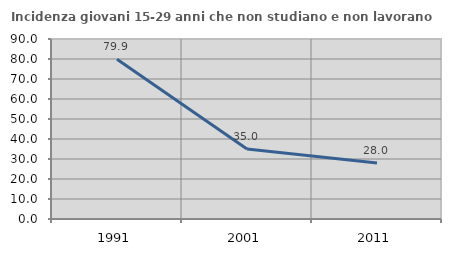
| Category | Incidenza giovani 15-29 anni che non studiano e non lavorano  |
|---|---|
| 1991.0 | 79.92 |
| 2001.0 | 35.047 |
| 2011.0 | 28.05 |